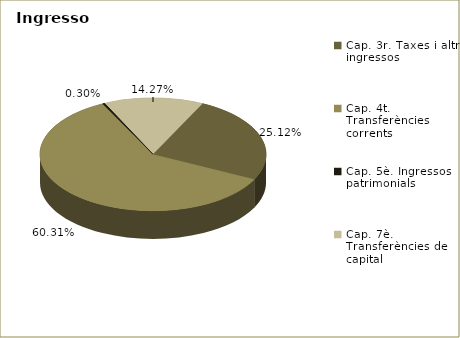
| Category | Series 0 |
|---|---|
| Cap. 3r. Taxes i altres ingressos | 86700111 |
| Cap. 4t. Transferències corrents | 208157854 |
| Cap. 5è. Ingressos patrimonials | 1033085 |
| Cap. 7è. Transferències de capital | 49235142 |